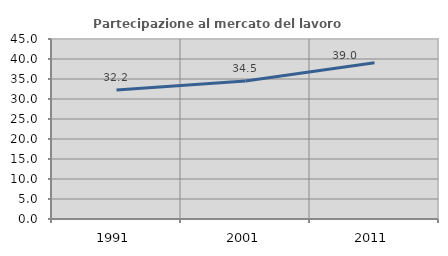
| Category | Partecipazione al mercato del lavoro  femminile |
|---|---|
| 1991.0 | 32.238 |
| 2001.0 | 34.525 |
| 2011.0 | 39.036 |